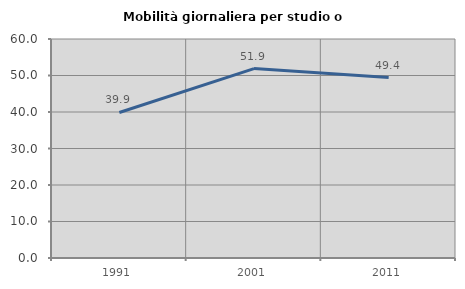
| Category | Mobilità giornaliera per studio o lavoro |
|---|---|
| 1991.0 | 39.872 |
| 2001.0 | 51.885 |
| 2011.0 | 49.433 |